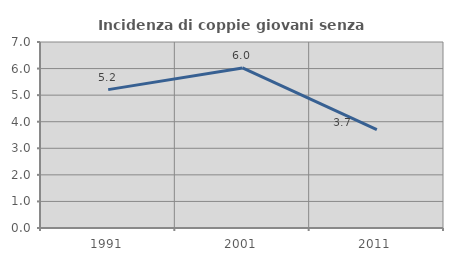
| Category | Incidenza di coppie giovani senza figli |
|---|---|
| 1991.0 | 5.208 |
| 2001.0 | 6.024 |
| 2011.0 | 3.704 |